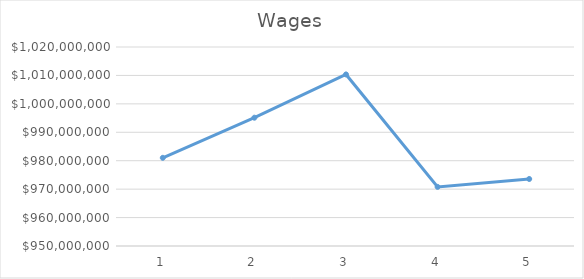
| Category | Series 0 |
|---|---|
| 0 | 981018000 |
| 1 | 995131000 |
| 2 | 1010349000 |
| 3 | 970794000 |
| 4 | 973574000 |